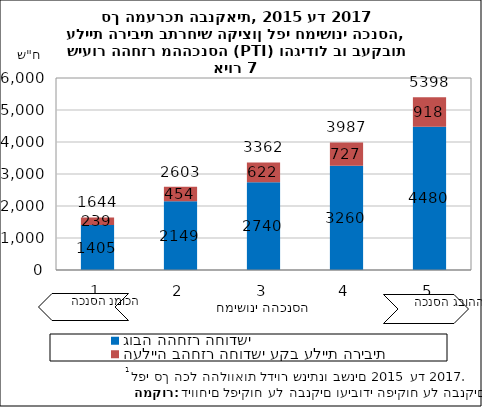
| Category | גובה ההחזר החודשי | העלייה בהחזר החודשי עקב עליית הריבית |
|---|---|---|
| 1.0 | 1404.591 | 239.138 |
| 2.0 | 2148.699 | 453.853 |
| 3.0 | 2739.912 | 622.027 |
| 4.0 | 3259.752 | 727.03 |
| 5.0 | 4479.626 | 918.409 |